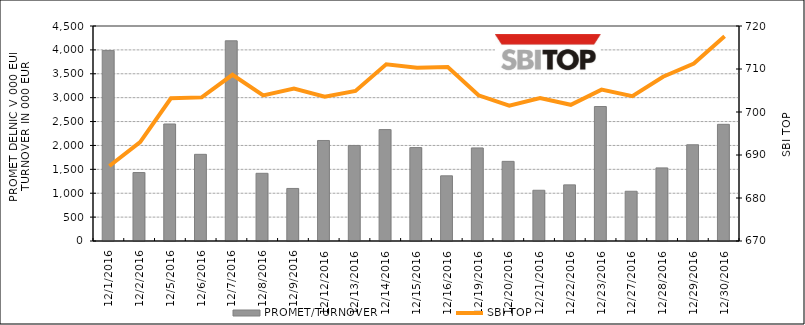
| Category | PROMET/TURNOVER |
|---|---|
| 12/1/16 | 3985 |
| 12/2/16 | 1433 |
| 12/5/16 | 2449 |
| 12/6/16 | 1814 |
| 12/7/16 | 4190 |
| 12/8/16 | 1417 |
| 12/9/16 | 1100 |
| 12/12/16 | 2104 |
| 12/13/16 | 2000 |
| 12/14/16 | 2332 |
| 12/15/16 | 1955 |
| 12/16/16 | 1364 |
| 12/19/16 | 1948 |
| 12/20/16 | 1667 |
| 12/21/16 | 1062 |
| 12/22/16 | 1175 |
| 12/23/16 | 2815 |
| 12/27/16 | 1041 |
| 12/28/16 | 1530 |
| 12/29/16 | 2014 |
| 12/30/16 | 2442 |